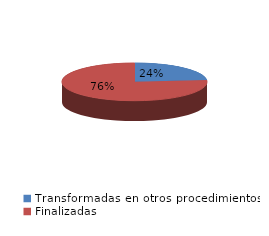
| Category | Series 0 |
|---|---|
| Transformadas en otros procedimientos | 1122 |
| Finalizadas | 3647 |